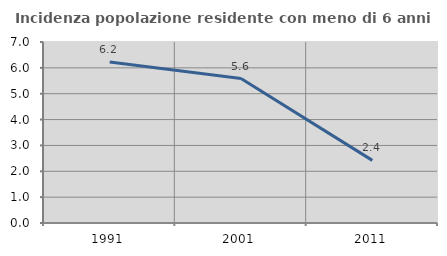
| Category | Incidenza popolazione residente con meno di 6 anni |
|---|---|
| 1991.0 | 6.223 |
| 2001.0 | 5.587 |
| 2011.0 | 2.423 |